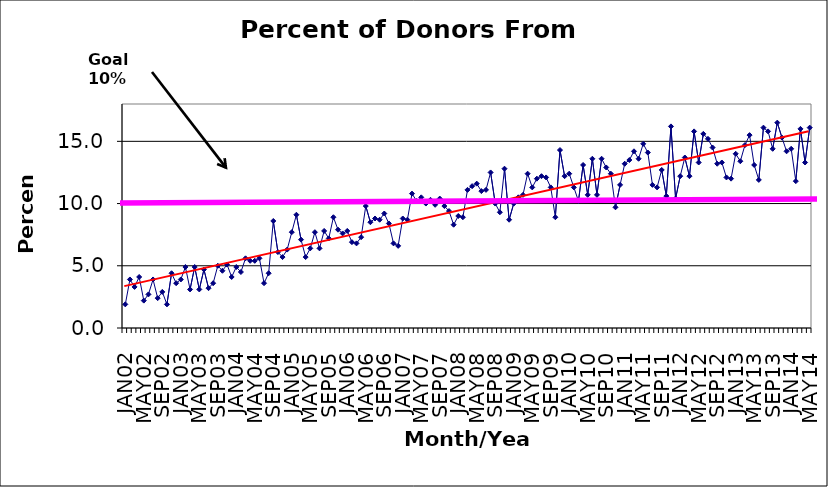
| Category | Series 0 |
|---|---|
| JAN02 | 1.9 |
| FEB02 | 3.9 |
| MAR02 | 3.3 |
| APR02 | 4.1 |
| MAY02 | 2.2 |
| JUN02 | 2.7 |
| JUL02 | 3.9 |
| AUG02 | 2.4 |
| SEP02 | 2.9 |
| OCT02 | 1.9 |
| NOV02 | 4.4 |
| DEC02 | 3.6 |
| JAN03 | 3.9 |
| FEB03 | 4.9 |
| MAR03 | 3.1 |
| APR03 | 4.9 |
| MAY03 | 3.1 |
| JUN03 | 4.7 |
| JUL03 | 3.2 |
| AUG03 | 3.6 |
| SEP03 | 5 |
| OCT03 | 4.6 |
| NOV03 | 5.1 |
| DEC03 | 4.1 |
| JAN04 | 4.9 |
| FEB04 | 4.5 |
| MAR04 | 5.6 |
| APR04 | 5.4 |
| MAY04 | 5.4 |
| JUN04 | 5.6 |
| JUL04 | 3.6 |
| AUG04 | 4.4 |
| SEP04 | 8.6 |
| OCT04 | 6.1 |
| NOV04 | 5.7 |
| DEC04 | 6.3 |
| JAN05 | 7.7 |
| FEB05 | 9.1 |
| MAR05 | 7.1 |
| APR05 | 5.7 |
| MAY05 | 6.4 |
| JUN05 | 7.7 |
| JUL05 | 6.4 |
| AUG05 | 7.8 |
| SEP05 | 7.2 |
| OCT05 | 8.9 |
| NOV05 | 7.9 |
| DEC05 | 7.6 |
| JAN06 | 7.8 |
| FEB06 | 6.9 |
| MAR06 | 6.8 |
| APR06 | 7.3 |
| MAY06 | 9.8 |
| JUN06 | 8.5 |
| JUL06 | 8.8 |
| AUG06 | 8.7 |
| SEP06 | 9.2 |
| OCT06 | 8.4 |
| NOV06 | 6.8 |
| DEC06 | 6.6 |
| JAN07 | 8.8 |
| FEB07 | 8.7 |
| MAR07 | 10.8 |
| APR07 | 10.2 |
| MAY07 | 10.5 |
| JUN07 | 10 |
| JUL07 | 10.3 |
| AUG07 | 9.9 |
| SEP07 | 10.4 |
| OCT07 | 9.8 |
| NOV07 | 9.4 |
| DEC07 | 8.3 |
| JAN08 | 9 |
| FEB08 | 8.9 |
| MAR08 | 11.1 |
| APR08 | 11.4 |
| MAY08 | 11.6 |
| JUN08 | 11 |
| JUL08 | 11.1 |
| AUG08 | 12.5 |
| SEP08 | 10 |
| OCT08 | 9.3 |
| NOV08 | 12.8 |
| DEC08 | 8.7 |
| JAN09 | 10 |
| FEB09 | 10.5 |
| MAR09 | 10.7 |
| APR09 | 12.4 |
| MAY09 | 11.3 |
| JUN09 | 12 |
| JUL09 | 12.2 |
| AUG09 | 12.1 |
| SEP09 | 11.3 |
| OCT09 | 8.9 |
| NOV09 | 14.3 |
| DEC09 | 12.2 |
| JAN10 | 12.4 |
| FEB10 | 11.3 |
| MAR10 | 10.2 |
| APR10 | 13.1 |
| MAY10 | 10.7 |
| JUN10 | 13.6 |
| JUL10 | 10.7 |
| AUG10 | 13.6 |
| SEP10 | 12.9 |
| OCT10 | 12.4 |
| NOV10 | 9.7 |
| DEC10 | 11.5 |
| JAN11 | 13.2 |
| FEB11 | 13.5 |
| MAR11 | 14.2 |
| APR11 | 13.6 |
| MAY11 | 14.8 |
| JUN11 | 14.1 |
| JUL11 | 11.5 |
| AUG11 | 11.3 |
| SEP11 | 12.7 |
| OCT11 | 10.6 |
| NOV11 | 16.2 |
| DEC11 | 10.4 |
| JAN12 | 12.2 |
| FEB12 | 13.7 |
| MAR12 | 12.2 |
| APR12 | 15.8 |
| MAY12 | 13.3 |
| JUN12 | 15.6 |
| JUL12 | 15.2 |
| AUG12 | 14.5 |
| SEP12 | 13.2 |
| OCT12 | 13.3 |
| NOV12 | 12.1 |
| DEC12 | 12 |
| JAN13 | 14 |
| FEB13 | 13.4 |
| MAR13 | 14.7 |
| APR13 | 15.5 |
| MAY13 | 13.1 |
| JUN13 | 11.9 |
| JUL13 | 16.1 |
| AUG13 | 15.8 |
| SEP13 | 14.4 |
| OCT13 | 16.5 |
| NOV13 | 15.3 |
| DEC13 | 14.2 |
| JAN14 | 14.4 |
| FEB14 | 11.8 |
| MAR14 | 16 |
| APR14 | 13.3 |
| MAY14 | 16.1 |